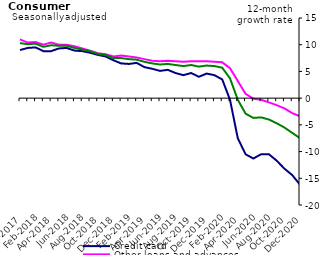
| Category | Credit card | Other loans and advances | Total |
|---|---|---|---|
| Dec-2017 | 9 | 11 | 10.3 |
| Jan-2018 | 9.4 | 10.4 | 10.1 |
| Feb-2018 | 9.5 | 10.5 | 10.2 |
| Mar-2018 | 8.8 | 10 | 9.6 |
| Apr-2018 | 8.8 | 10.4 | 9.9 |
| May-2018 | 9.3 | 10 | 9.8 |
| Jun-2018 | 9.4 | 10 | 9.8 |
| Jul-2018 | 8.9 | 9.7 | 9.4 |
| Aug-2018 | 8.8 | 9.3 | 9.1 |
| Sep-2018 | 8.5 | 8.9 | 8.8 |
| Oct-2018 | 8.1 | 8.4 | 8.3 |
| Nov-2018 | 7.8 | 8.2 | 8.1 |
| Dec-2018 | 7.1 | 7.8 | 7.5 |
| Jan-2019 | 6.5 | 8 | 7.5 |
| Feb-2019 | 6.4 | 7.8 | 7.3 |
| Mar-2019 | 6.6 | 7.6 | 7.2 |
| Apr-2019 | 5.8 | 7.3 | 6.8 |
| May-2019 | 5.5 | 7 | 6.5 |
| Jun-2019 | 5.1 | 6.9 | 6.3 |
| Jul-2019 | 5.3 | 7 | 6.4 |
| Aug-2019 | 4.7 | 6.9 | 6.2 |
| Sep-2019 | 4.3 | 6.8 | 6 |
| Oct-2019 | 4.7 | 6.9 | 6.2 |
| Nov-2019 | 4 | 6.9 | 5.9 |
| Dec-2019 | 4.6 | 6.9 | 6.1 |
| Jan-2020 | 4.3 | 6.8 | 6 |
| Feb-2020 | 3.5 | 6.7 | 5.7 |
| Mar-2020 | -0.3 | 5.6 | 3.7 |
| Apr-2020 | -7.5 | 3.2 | -0.3 |
| May-2020 | -10.5 | 0.8 | -2.9 |
| Jun-2020 | -11.3 | -0.1 | -3.7 |
| Jul-2020 | -10.5 | -0.3 | -3.6 |
| Aug-2020 | -10.5 | -0.8 | -4 |
| Sep-2020 | -11.7 | -1.3 | -4.7 |
| Oct-2020 | -13.2 | -1.9 | -5.5 |
| Nov-2020 | -14.4 | -2.8 | -6.5 |
| Dec-2020 | -16.2 | -3.4 | -7.5 |